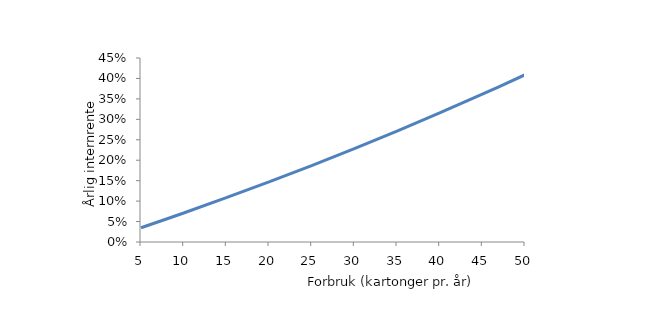
| Category | Series 0 |
|---|---|
| 5.0 | 0.035 |
| 10.0 | 0.071 |
| 15.0 | 0.108 |
| 20.0 | 0.147 |
| 25.0 | 0.187 |
| 30.0 | 0.228 |
| 35.0 | 0.271 |
| 40.0 | 0.316 |
| 45.0 | 0.361 |
| 50.0 | 0.409 |